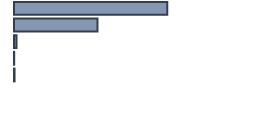
| Category | Percentatge |
|---|---|
| 0 | 63.864 |
| 1 | 34.773 |
| 2 | 1.061 |
| 3 | 0.076 |
| 4 | 0.227 |
| 5 | 0 |